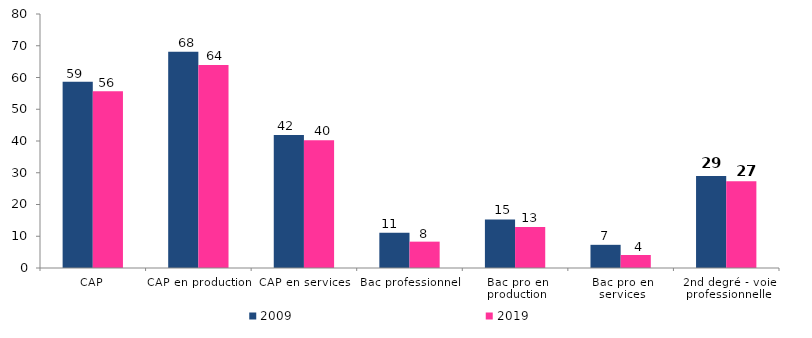
| Category | 2009 | 2019 |
|---|---|---|
| CAP | 58.7 | 55.7 |
| CAP en production | 68.1 | 63.9 |
| CAP en services | 41.9 | 40.2 |
| Bac professionnel | 11.1 | 8.3 |
| Bac pro en production | 15.3 | 12.9 |
| Bac pro en services | 7.3 | 4.1 |
| 2nd degré - voie professionnelle | 29 | 27.3 |